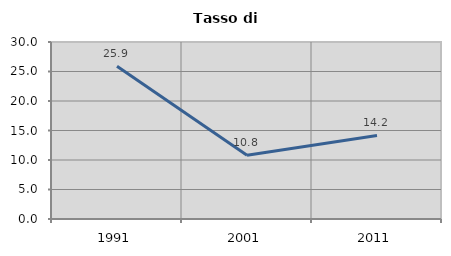
| Category | Tasso di disoccupazione   |
|---|---|
| 1991.0 | 25.875 |
| 2001.0 | 10.788 |
| 2011.0 | 14.153 |